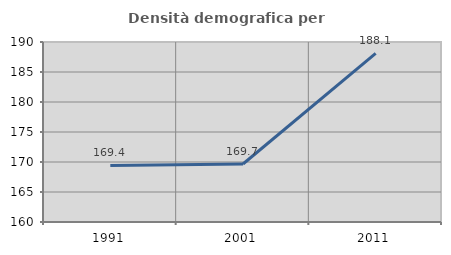
| Category | Densità demografica |
|---|---|
| 1991.0 | 169.433 |
| 2001.0 | 169.667 |
| 2011.0 | 188.104 |